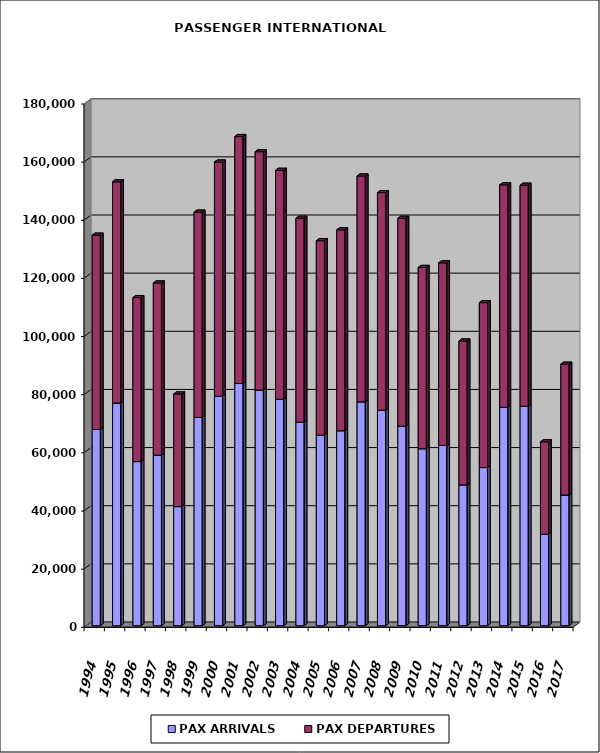
| Category | PAX ARRIVALS | PAX DEPARTURES |
|---|---|---|
| 1994.0 | 67481 | 66863 |
| 1995.0 | 76576 | 76126 |
| 1996.0 | 56456 | 56409 |
| 1997.0 | 58654 | 59244 |
| 1998.0 | 40969 | 38739 |
| 1999.0 | 71636 | 70632 |
| 2000.0 | 78965 | 80529 |
| 2001.0 | 83331 | 84936 |
| 2002.0 | 81045 | 81994 |
| 2003.0 | 77903 | 78735 |
| 2004.0 | 69995 | 70158 |
| 2005.0 | 65542 | 66893 |
| 2006.0 | 67078 | 69097 |
| 2007.0 | 77004 | 77704 |
| 2008.0 | 74151 | 74824 |
| 2009.0 | 68655 | 71480 |
| 2010.0 | 60882 | 62358 |
| 2011.0 | 62008 | 62792 |
| 2012.0 | 48435 | 49499 |
| 2013.0 | 54395 | 56724 |
| 2014.0 | 75139 | 76503 |
| 2015.0 | 75475 | 76049 |
| 2016.0 | 31480 | 31746 |
| 2017.0 | 44958 | 44996 |